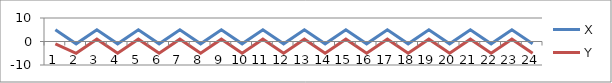
| Category | X | Y |
|---|---|---|
| 0 | 5 | -1 |
| 1 | -1 | -5 |
| 2 | 5 | 1 |
| 3 | -1 | -5 |
| 4 | 5 | 1 |
| 5 | -1 | -5 |
| 6 | 5 | 1 |
| 7 | -1 | -5 |
| 8 | 5 | 1 |
| 9 | -1 | -5 |
| 10 | 5 | 1 |
| 11 | -1 | -5 |
| 12 | 5 | 1 |
| 13 | -1 | -5 |
| 14 | 5 | 1 |
| 15 | -1 | -5 |
| 16 | 5 | 1 |
| 17 | -1 | -5 |
| 18 | 5 | 1 |
| 19 | -1 | -5 |
| 20 | 5 | 1 |
| 21 | -1 | -5 |
| 22 | 5 | 1 |
| 23 | -1 | -5 |